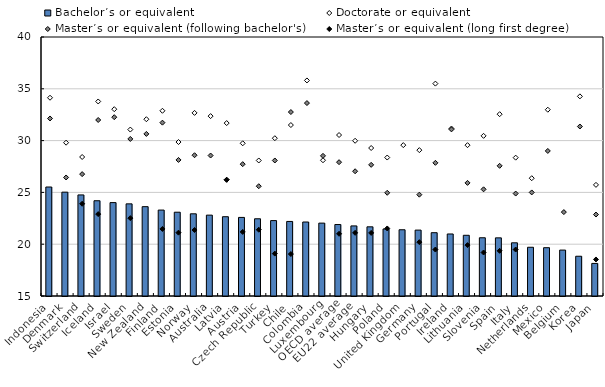
| Category | Bachelor’s or equivalent |
|---|---|
| Indonesia | 25.521 |
| Denmark | 25.023 |
| Switzerland | 24.755 |
| Iceland | 24.195 |
| Israel | 24.015 |
| Sweden | 23.895 |
| New Zealand | 23.624 |
| Finland | 23.294 |
| Estonia | 23.088 |
| Norway | 22.934 |
| Australia | 22.806 |
| Latvia | 22.653 |
| Austria | 22.585 |
| Czech Republic | 22.454 |
| Turkey | 22.279 |
| Chile | 22.197 |
| Colombia | 22.142 |
| Luxembourg | 22.036 |
| OECD average | 21.899 |
| EU22 average | 21.765 |
| Hungary | 21.678 |
| Poland | 21.471 |
| United Kingdom | 21.393 |
| Germany | 21.36 |
| Portugal | 21.111 |
| Ireland | 20.988 |
| Lithuania | 20.86 |
| Slovenia | 20.622 |
| Spain | 20.612 |
| Italy | 20.134 |
| Netherlands | 19.705 |
| Mexico | 19.663 |
| Belgium | 19.432 |
| Korea | 18.838 |
| Japan | 18.145 |